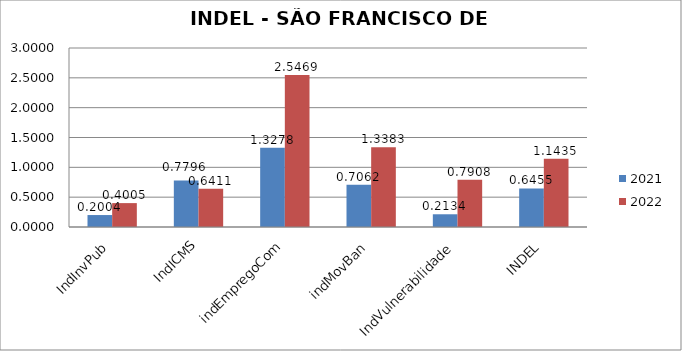
| Category | 2021 | 2022 |
|---|---|---|
| IndInvPub | 0.2 | 0.401 |
| IndICMS | 0.78 | 0.641 |
| indEmpregoCom | 1.328 | 2.547 |
| indMovBan | 0.706 | 1.338 |
| IndVulnerabilidade | 0.213 | 0.791 |
| INDEL | 0.645 | 1.144 |